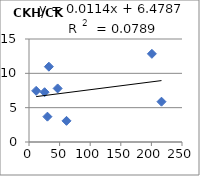
| Category | CKH/CKF |
|---|---|
| 25.5 | 7.25 |
| 61.3 | 3.08 |
| 11.7 | 7.45 |
| 216.5 | 5.87 |
| 46.8 | 7.8 |
| 32.5 | 10.97 |
| 200.8 | 12.84 |
| 30.1 | 3.69 |